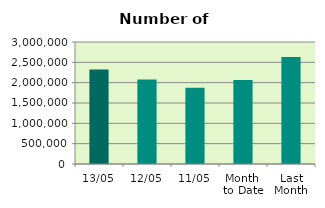
| Category | Series 0 |
|---|---|
| 13/05 | 2321876 |
| 12/05 | 2077090 |
| 11/05 | 1873790 |
| Month 
to Date | 2067250.25 |
| Last
Month | 2628131 |